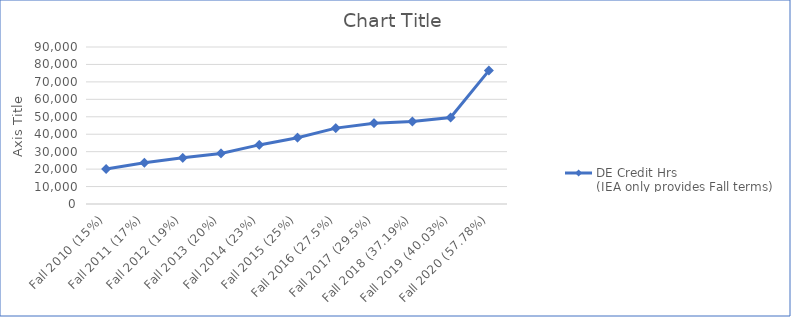
| Category | Breakdown: % of UWG Headcount taking at least ONE partially or fully online course (D,N,or G) | Breakdown: % of UWG Headcount taking at least one FULLY online course (N or G) | DE Credit Hrs 
(IEA only provides Fall terms) |
|---|---|---|---|
| Fall 2010 (15%) |  |  | 20098 |
| Fall 2011 (17%) |  |  | 23626 |
| Fall 2012 (19%) |  |  | 26456 |
| Fall 2013 (20%) |  |  | 28983 |
| Fall 2014 (23%) |  |  | 33878 |
| Fall 2015 (25%) |  |  | 38026 |
| Fall 2016 (27.5%) |  |  | 43507 |
| Fall 2017 (29.5%) |  |  | 46342 |
| Fall 2018 (37.19%) |  |  | 47283 |
| Fall 2019 (40.03%) |  |  | 49590 |
| Fall 2020 (57.78%) |  |  | 76472 |